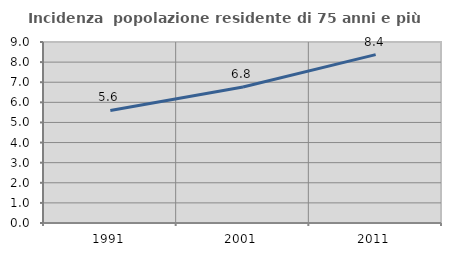
| Category | Incidenza  popolazione residente di 75 anni e più |
|---|---|
| 1991.0 | 5.595 |
| 2001.0 | 6.766 |
| 2011.0 | 8.373 |